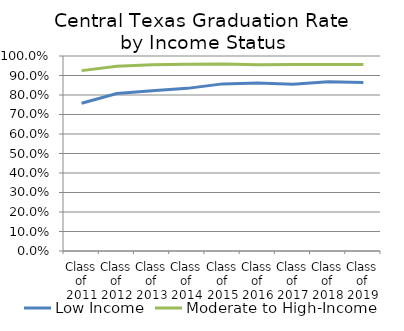
| Category | Low Income | Moderate to High-Income |
|---|---|---|
| Class of 2011 | 0.758 | 0.925 |
| Class of 2012 | 0.808 | 0.947 |
| Class of 2013 | 0.822 | 0.955 |
| Class of 2014 | 0.834 | 0.958 |
| Class of 2015 | 0.857 | 0.959 |
| Class of 2016 | 0.862 | 0.955 |
| Class of 2017 | 0.855 | 0.956 |
| Class of 2018 | 0.868 | 0.957 |
| Class of 2019 | 0.864 | 0.957 |